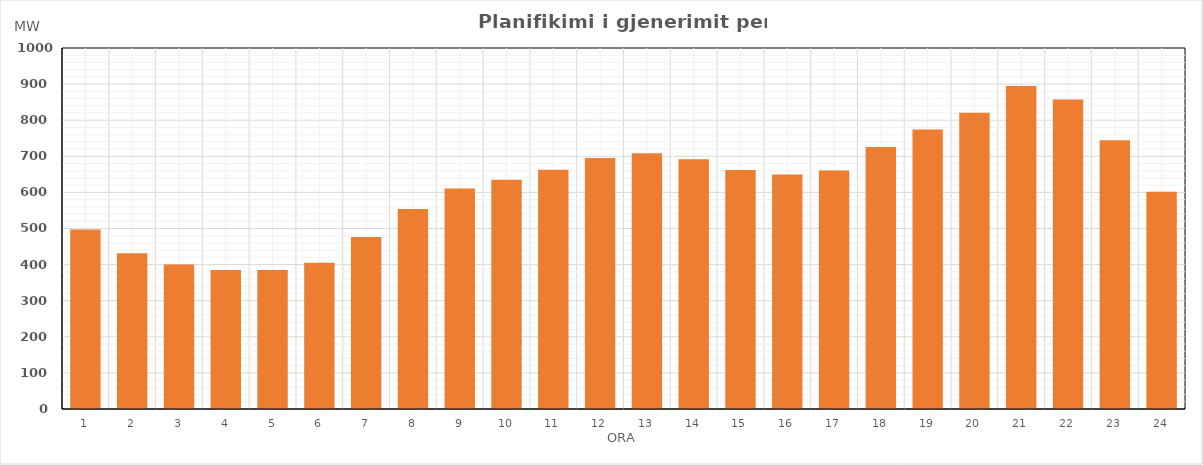
| Category | Max (MW) |
|---|---|
| 0 | 496.97 |
| 1 | 431.33 |
| 2 | 400.32 |
| 3 | 384.74 |
| 4 | 385.11 |
| 5 | 405.33 |
| 6 | 476.4 |
| 7 | 553.68 |
| 8 | 610.69 |
| 9 | 634.92 |
| 10 | 662.59 |
| 11 | 695.11 |
| 12 | 708.4 |
| 13 | 692.02 |
| 14 | 661.78 |
| 15 | 649.6 |
| 16 | 660.56 |
| 17 | 726 |
| 18 | 774.13 |
| 19 | 820.52 |
| 20 | 894.88 |
| 21 | 857.67 |
| 22 | 744.2 |
| 23 | 601.59 |